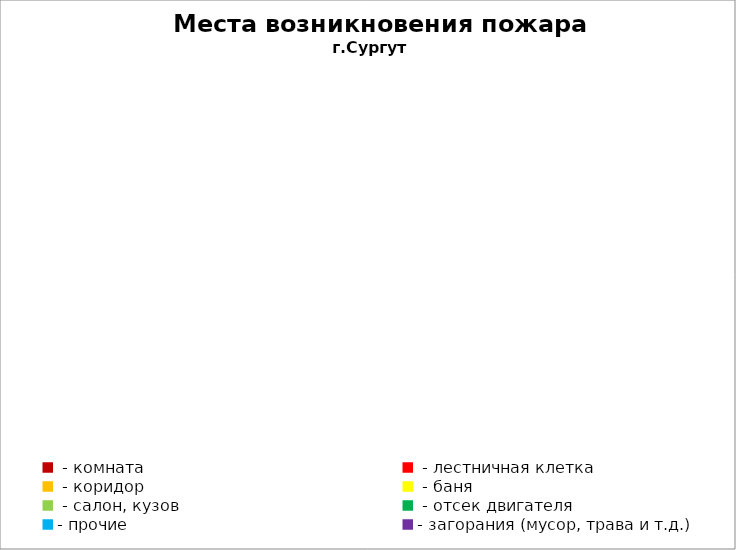
| Category | Места возникновения пожара |
|---|---|
|  - комната | 30 |
|  - лестничная клетка | 5 |
|  - коридор | 7 |
|  - баня | 9 |
|  - салон, кузов | 16 |
|  - отсек двигателя | 28 |
| - прочие | 95 |
| - загорания (мусор, трава и т.д.)  | 84 |